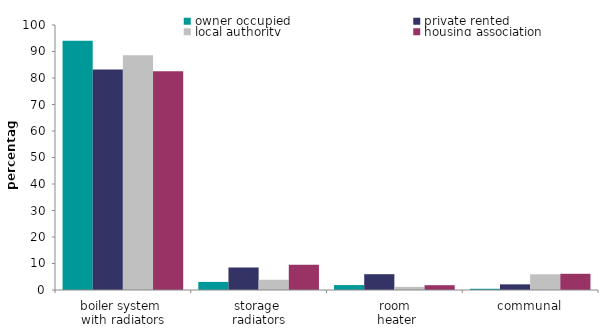
| Category | owner occupied | private rented | local authority | housing association |
|---|---|---|---|---|
| boiler system 
with radiators | 94.039 | 83.177 | 88.559 | 82.518 |
| storage 
radiators | 3.055 | 8.496 | 3.86 | 9.528 |
| room
 heater | 1.861 | 5.963 | 1.181 | 1.812 |
| communal | 0.466 | 2.133 | 5.936 | 6.119 |